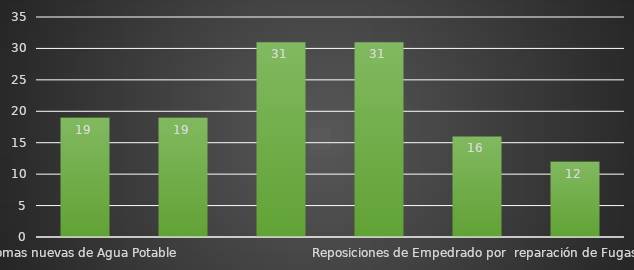
| Category | INDICADOR  |
|---|---|
| Tomas nuevas de Agua Potable | 19 |
| Descargas nuevas de Drenaje | 19 |
| Fugas de Agua Atendidas en vía Publica | 31 |
| Desazolves de Drenaje | 31 |
| Reposiciones de Empedrado por  reparación de Fugas | 16 |
| Reposiciones de Cemento por concepto de reparación de Fugas | 12 |